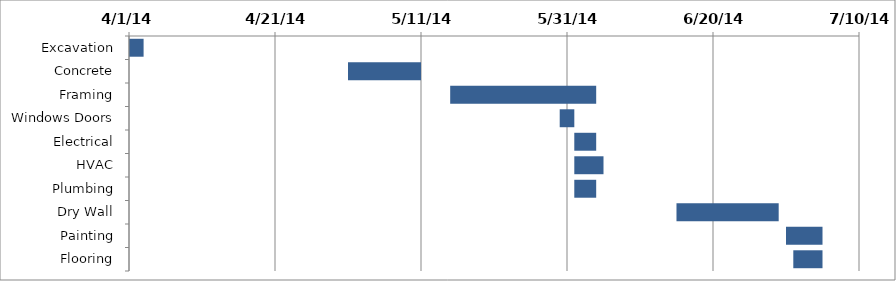
| Category | Start Date | Days |
|---|---|---|
| Excavation | 4/1/14 | 2 |
| Concrete | 5/1/14 | 10 |
| Framing | 5/15/14 | 20 |
| Windows Doors | 5/30/14 | 2 |
| Electrical | 6/1/14 | 3 |
| HVAC | 6/1/14 | 4 |
| Plumbing | 6/1/14 | 3 |
| Dry Wall | 6/15/14 | 14 |
| Painting | 6/30/14 | 5 |
| Flooring | 7/1/14 | 4 |